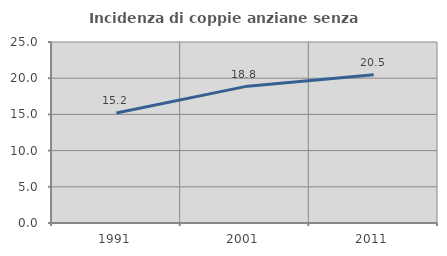
| Category | Incidenza di coppie anziane senza figli  |
|---|---|
| 1991.0 | 15.187 |
| 2001.0 | 18.837 |
| 2011.0 | 20.465 |